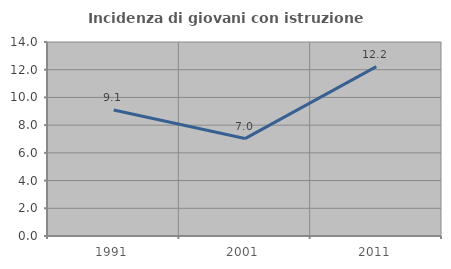
| Category | Incidenza di giovani con istruzione universitaria |
|---|---|
| 1991.0 | 9.091 |
| 2001.0 | 7.031 |
| 2011.0 | 12.222 |